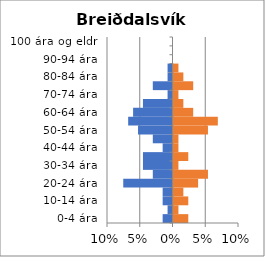
| Category | % karlar | %konur |
|---|---|---|
| 0-4 ára | -0.015 | 0.023 |
| 5-9 ára | -0.008 | 0.008 |
| 10-14 ára | -0.015 | 0.023 |
| 15-19 ára | -0.015 | 0.015 |
| 20-24 ára | -0.075 | 0.038 |
| 25-29 ára | -0.03 | 0.053 |
| 30-34 ára | -0.045 | 0.008 |
| 35-39 ára | -0.045 | 0.023 |
| 40-44 ára | -0.015 | 0.008 |
| 45-49 ára | -0.03 | 0.008 |
| 50-54 ára | -0.053 | 0.053 |
| 55-59 ára | -0.068 | 0.068 |
| 60-64 ára | -0.06 | 0.03 |
| 65-69 ára | -0.045 | 0.015 |
| 70-74 ára | -0.008 | 0.008 |
| 75-79 ára | -0.03 | 0.03 |
| 80-84 ára | -0.008 | 0.015 |
| 85-89 ára | -0.008 | 0.008 |
| 90-94 ára | 0 | 0 |
| 95-99 ára | 0 | 0 |
| 100 ára og eldri | 0 | 0 |